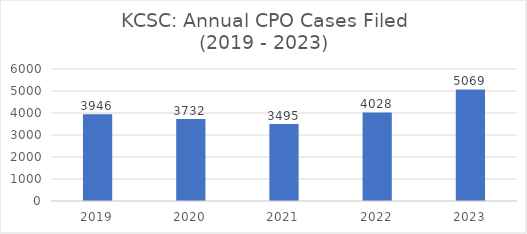
| Category | Total (Annual or YTD) |
|---|---|
| 2019.0 | 3946 |
| 2020.0 | 3732 |
| 2021.0 | 3495 |
| 2022.0 | 4028 |
| 2023.0 | 5069 |